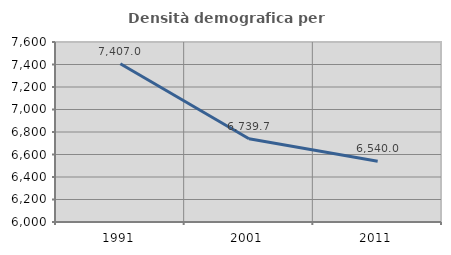
| Category | Densità demografica |
|---|---|
| 1991.0 | 7407.024 |
| 2001.0 | 6739.719 |
| 2011.0 | 6540.049 |